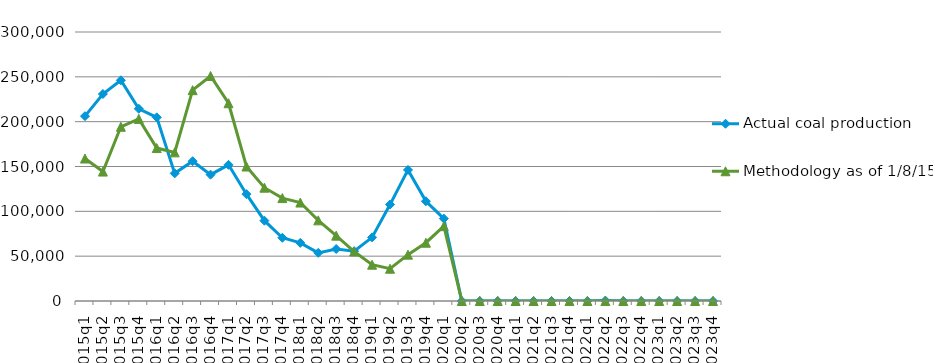
| Category | Actual coal production | Methodology as of 1/8/15 |
|---|---|---|
| 2015q1 | 206123 | 158896 |
| 2015q2 | 230855 | 144351 |
| 2015q3 | 246150 | 194309 |
| 2015q4 | 214356 | 203107 |
| 2016q1 | 204815 | 170562 |
| 2016q2 | 142346 | 165770 |
| 2016q3 | 155922 | 235129 |
| 2016q4 | 140898 | 250938 |
| 2017q1 | 151872 | 220565 |
| 2017q2 | 119144 | 149981 |
| 2017q3 | 89578 | 126377 |
| 2017q4 | 70518 | 114769 |
| 2018q1 | 64815 | 109786 |
| 2018q2 | 53688 | 89943 |
| 2018q3 | 57959 | 72876 |
| 2018q4 | 55568 | 55196 |
| 2019q1 | 70979 | 40468 |
| 2019q2 | 107531 | 35993 |
| 2019q3 | 146176 | 51692 |
| 2019q4 | 111237 | 64995 |
| 2020q1 | 91871 | 83477 |
| 2020q2 | 0 | 0 |
| 2020q3 | 0 | 0 |
| 2020q4 | 0 | 0 |
| 2021q1 | 0 | 0 |
| 2021q2 | 0 | 0 |
| 2021q3 | 0 | 0 |
| 2021q4 | 0 | 0 |
| 2022q1 | 0 | 0 |
| 2022q2 | 482 | 0 |
| 2022q3 | 0 | 0 |
| 2022q4 | 0 | 0 |
| 2023q1 | 0 | 0 |
| 2023q2 | 0 | 0 |
| 2023q3 | 0 | 0 |
| 2023q4 | 0 | 0 |